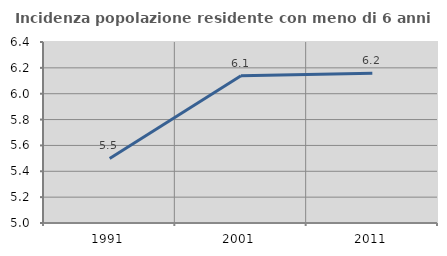
| Category | Incidenza popolazione residente con meno di 6 anni |
|---|---|
| 1991.0 | 5.499 |
| 2001.0 | 6.139 |
| 2011.0 | 6.158 |